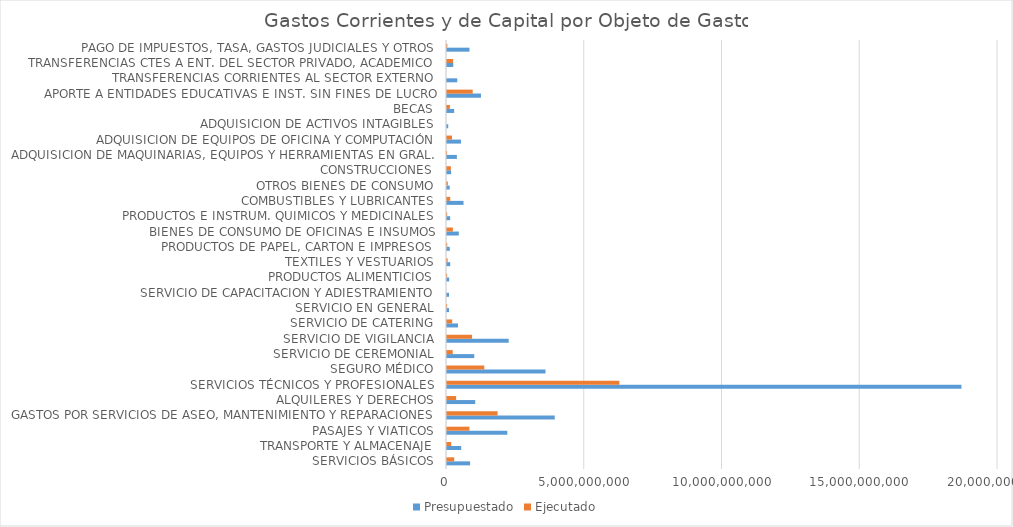
| Category | Presupuestado | Ejecutado |
|---|---|---|
| SERVICIOS BÁSICOS | 838500000 | 261033454 |
| TRANSPORTE Y ALMACENAJE | 515600000 | 152432000 |
| PASAJES Y VIATICOS | 2187927836 | 813631089 |
| GASTOS POR SERVICIOS DE ASEO, MANTENIMIENTO Y REPARACIONES | 3911038785 | 1836839931 |
| ALQUILERES Y DERECHOS | 1023998502 | 330976766 |
| SERVICIOS TÉCNICOS Y PROFESIONALES | 18673858437 | 6255630907 |
| SEGURO MÉDICO | 3575960250 | 1353380000 |
| SERVICIO DE CEREMONIAL | 989650000 | 208133141 |
| SERVICIO DE VIGILANCIA | 2239295144 | 909750000 |
| SERVICIO DE CATERING | 400000000 | 188205875 |
| SERVICIO EN GENERAL | 74800000 | 4944500 |
| SERVICIO DE CAPACITACION Y ADIESTRAMIENTO | 72081087 | 0 |
| PRODUCTOS ALIMENTICIOS | 79053050 | 4999540 |
| TEXTILES Y VESTUARIOS | 116275000 | 22540900 |
| PRODUCTOS DE PAPEL, CARTON E IMPRESOS | 100101200 | 8485200 |
| BIENES DE CONSUMO DE OFICINAS E INSUMOS | 428505120 | 213994637 |
| PRODUCTOS E INSTRUM. QUIMICOS Y MEDICINALES | 113796400 | 6978516 |
| COMBUSTIBLES Y LUBRICANTES | 600000000 | 117269189 |
| OTROS BIENES DE CONSUMO | 96829000 | 29569965 |
| CONSTRUCCIONES | 150000000 | 140495013 |
| ADQUISICION DE MAQUINARIAS, EQUIPOS Y HERRAMIENTAS EN GRAL. | 359072197 | 2655000 |
| ADQUISICION DE EQUIPOS DE OFICINA Y COMPUTACIÓN | 506643913 | 182389175 |
| ADQUISICION DE ACTIVOS INTAGIBLES | 45164092 | 0 |
| BECAS | 259200000 | 102360000 |
| APORTE A ENTIDADES EDUCATIVAS E INST. SIN FINES DE LUCRO | 1232766736 | 932766736 |
| TRANSFERENCIAS CORRIENTES AL SECTOR EXTERNO | 372249965 | 0 |
| TRANSFERENCIAS CTES A ENT. DEL SECTOR PRIVADO, ACADEMICO | 228000000 | 221088000 |
| PAGO DE IMPUESTOS, TASA, GASTOS JUDICIALES Y OTROS | 815860362 | 11745226 |